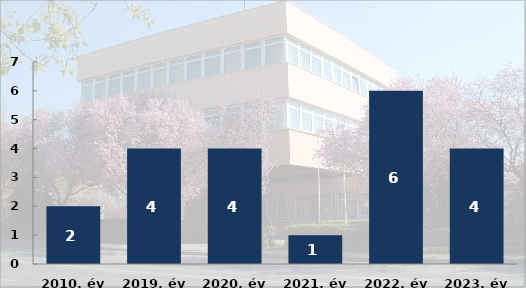
| Category | Súlyosan sérült személyek száma (fő) |
|---|---|
| 2010. év | 2 |
| 2019. év | 4 |
| 2020. év | 4 |
| 2021. év | 1 |
| 2022. év | 6 |
| 2023. év | 4 |